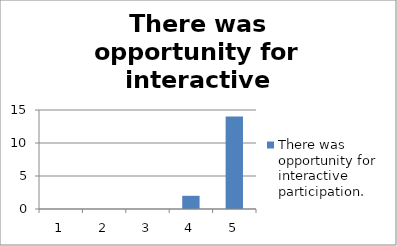
| Category | There was opportunity for interactive participation. |
|---|---|
| 0 | 0 |
| 1 | 0 |
| 2 | 0 |
| 3 | 2 |
| 4 | 14 |